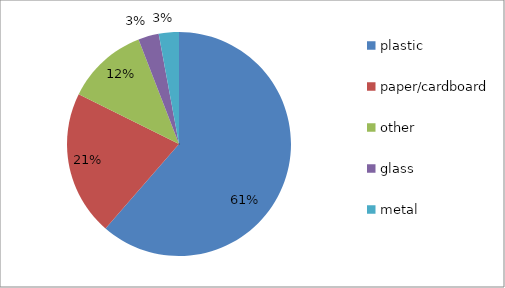
| Category | Series 0 |
|---|---|
| plastic | 0.614 |
| paper/cardboard | 0.21 |
| other | 0.118 |
| glass | 0.03 |
| metal | 0.029 |